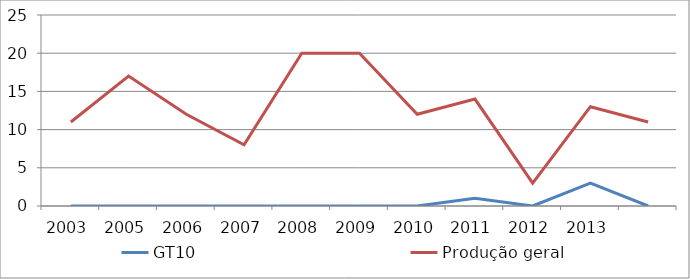
| Category | GT10 | Produção geral |
|---|---|---|
| 2003.0 | 0 | 11 |
| 2005.0 | 0 | 17 |
| 2006.0 | 0 | 12 |
| 2007.0 | 0 | 8 |
| 2008.0 | 0 | 20 |
| 2009.0 | 0 | 20 |
| 2010.0 | 0 | 12 |
| 2011.0 | 1 | 14 |
| 2012.0 | 0 | 3 |
| 2013.0 | 3 | 13 |